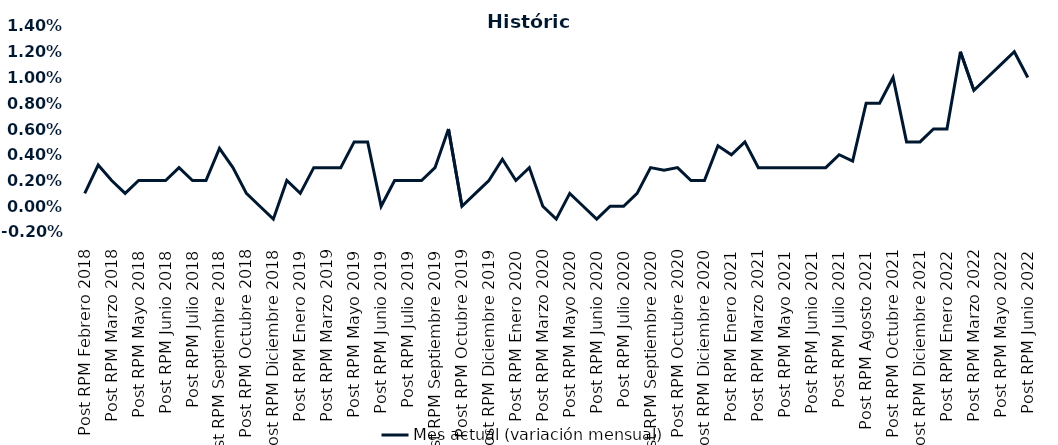
| Category | Mes actual (variación mensual)  |
|---|---|
| Post RPM Febrero 2018 | 0.001 |
| Pre RPM Marzo 2018 | 0.003 |
| Post RPM Marzo 2018 | 0.002 |
| Pre RPM Mayo 2018 | 0.001 |
| Post RPM Mayo 2018 | 0.002 |
| Pre RPM Junio 2018 | 0.002 |
| Post RPM Junio 2018 | 0.002 |
| Pre RPM Julio 2018 | 0.003 |
| Post RPM Julio 2018 | 0.002 |
| Pre RPM Septiembre 2018 | 0.002 |
| Post RPM Septiembre 2018 | 0.004 |
| Pre RPM Octubre 2018 | 0.003 |
| Post RPM Octubre 2018 | 0.001 |
| Pre RPM Diciembre 2018 | 0 |
| Post RPM Diciembre 2018 | -0.001 |
| Pre RPM Enero 2019 | 0.002 |
| Post RPM Enero 2019 | 0.001 |
| Pre RPM Marzo 2019 | 0.003 |
| Post RPM Marzo 2019 | 0.003 |
| Pre RPM Mayo 2019 | 0.003 |
| Post RPM Mayo 2019 | 0.005 |
| Pre RPM Junio 2019 | 0.005 |
| Post RPM Junio 2019 | 0 |
| Pre RPM Julio 2019 | 0.002 |
| Post RPM Julio 2019 | 0.002 |
| Pre RPM Septiembre 2019 | 0.002 |
| Post RPM Septiembre 2019 | 0.003 |
| Pre RPM Octubre 2019 | 0.006 |
| Post RPM Octubre 2019 | 0 |
| Pre RPM Diciembre 2019 | 0.001 |
| Post RPM Diciembre 2019 | 0.002 |
| Pre RPM Enero 2020 | 0.004 |
| Post RPM Enero 2020 | 0.002 |
| Pre RPM Marzo 2020 | 0.003 |
| Post RPM Marzo 2020 | 0 |
| Pre RPM Mayo 2020 | -0.001 |
| Post RPM Mayo 2020 | 0.001 |
| Pre RPM Junio 2020 | 0 |
| Post RPM Junio 2020 | -0.001 |
| Pre RPM Julio 2020 | 0 |
| Post RPM Julio 2020 | 0 |
| Pre RPM Septiembre 2020 | 0.001 |
| Post RPM Septiembre 2020 | 0.003 |
| Pre RPM Octubre 2020 | 0.003 |
| Post RPM Octubre 2020 | 0.003 |
| Pre RPM Diciembre 2020 | 0.002 |
| Post RPM Diciembre 2020 | 0.002 |
| Pre RPM Enero 2021 | 0.005 |
| Post RPM Enero 2021 | 0.004 |
| Pre RPM Marzo 2021 | 0.005 |
| Post RPM Marzo 2021 | 0.003 |
| Pre RPM Mayo 2021 | 0.003 |
| Post RPM Mayo 2021 | 0.003 |
| Pre RPM Junio 2021 | 0.003 |
| Post RPM Junio 2021 | 0.003 |
| Pre RPM Julio 2021 | 0.003 |
| Post RPM Julio 2021 | 0.004 |
| Pre RPM Agosto 2021 | 0.004 |
| Post RPM Agosto 2021 | 0.008 |
| Pre RPM Octubre 2021 | 0.008 |
| Post RPM Octubre 2021 | 0.01 |
| Pre RPM Diciembre 2021 | 0.005 |
| Post RPM Diciembre 2021 | 0.005 |
| Pre RPM Enero 2022 | 0.006 |
| Post RPM Enero 2022 | 0.006 |
| Pre RPM Marzo 2022 | 0.012 |
| Post RPM Marzo 2022 | 0.009 |
| Pre RPM Mayo 2022 | 0.01 |
| Post RPM Mayo 2022 | 0.011 |
| Pre RPM Junio 2022 | 0.012 |
| Post RPM Junio 2022 | 0.01 |